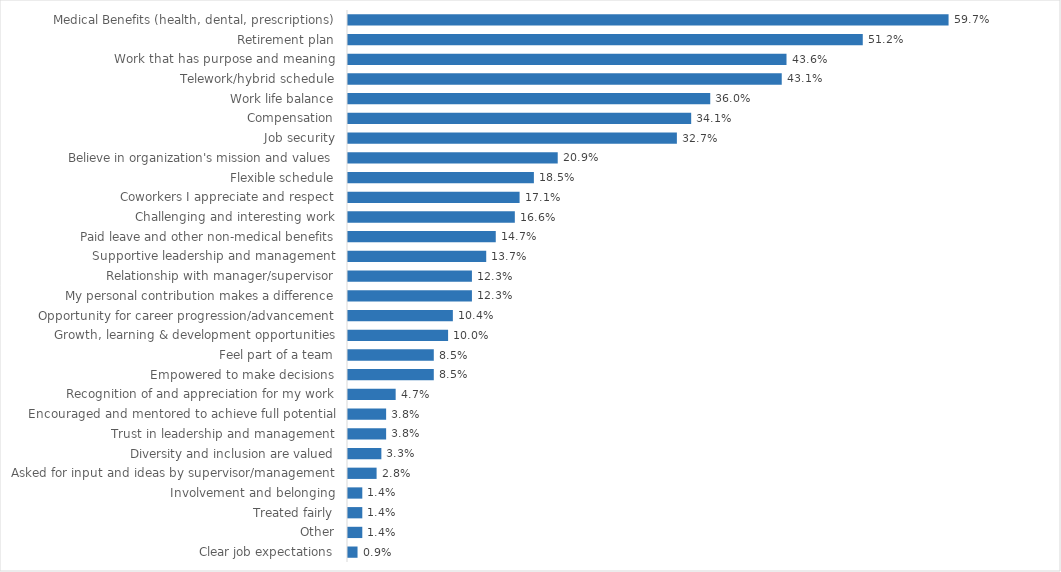
| Category | Disabilities, Aging, Independent Living |
|---|---|
| Medical Benefits (health, dental, prescriptions) | 0.597 |
| Retirement plan | 0.512 |
| Work that has purpose and meaning | 0.436 |
| Telework/hybrid schedule | 0.431 |
| Work life balance | 0.36 |
| Compensation | 0.341 |
| Job security | 0.327 |
| Believe in organization's mission and values | 0.209 |
| Flexible schedule | 0.185 |
| Coworkers I appreciate and respect | 0.171 |
| Challenging and interesting work | 0.166 |
| Paid leave and other non-medical benefits | 0.147 |
| Supportive leadership and management | 0.137 |
| Relationship with manager/supervisor | 0.123 |
| My personal contribution makes a difference | 0.123 |
| Opportunity for career progression/advancement | 0.104 |
| Growth, learning & development opportunities | 0.1 |
| Feel part of a team | 0.085 |
| Empowered to make decisions | 0.085 |
| Recognition of and appreciation for my work | 0.047 |
| Encouraged and mentored to achieve full potential | 0.038 |
| Trust in leadership and management | 0.038 |
| Diversity and inclusion are valued | 0.033 |
| Asked for input and ideas by supervisor/management | 0.028 |
| Involvement and belonging | 0.014 |
| Treated fairly | 0.014 |
| Other | 0.014 |
| Clear job expectations | 0.009 |